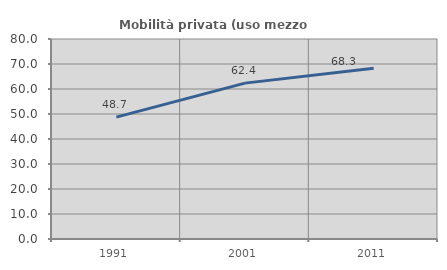
| Category | Mobilità privata (uso mezzo privato) |
|---|---|
| 1991.0 | 48.737 |
| 2001.0 | 62.351 |
| 2011.0 | 68.321 |